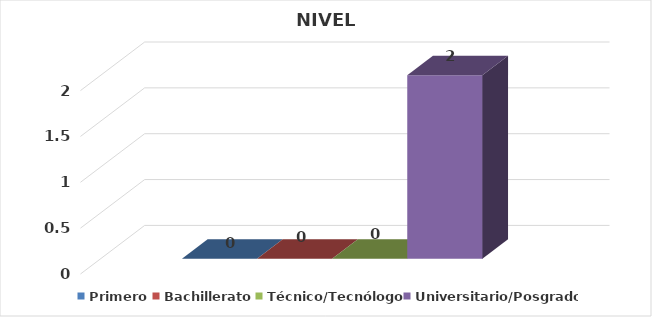
| Category | Primero | Bachillerato | Técnico/Tecnólogo | Universitario/Posgrado |
|---|---|---|---|---|
| 0 | 0 | 0 | 0 | 2 |